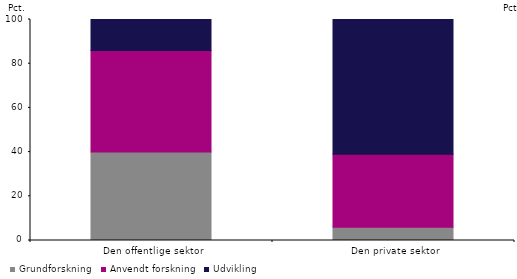
| Category | Grundforskning | Anvendt forskning | Udvikling |
|---|---|---|---|
| Den offentlige sektor | 40 | 46 | 14 |
| Den private sektor | 6 | 33 | 61 |